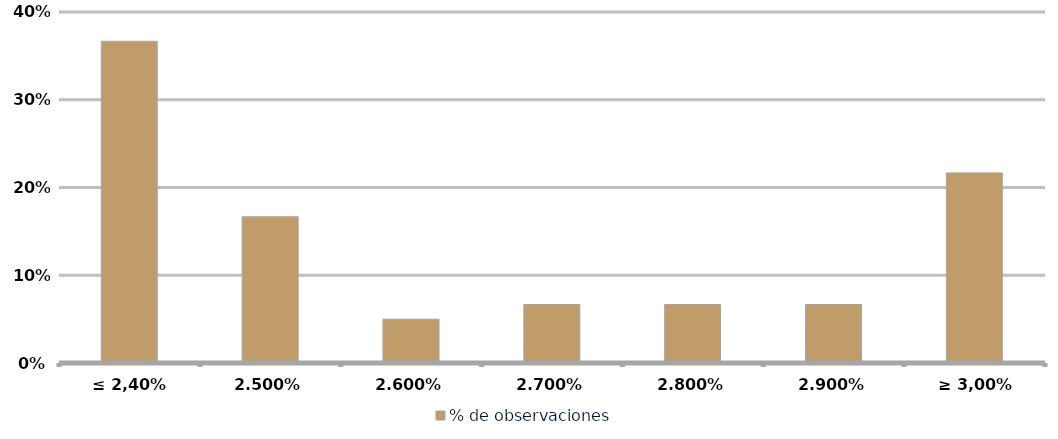
| Category | % de observaciones  |
|---|---|
| ≤ 2,40% | 0.367 |
| 2.50% | 0.167 |
| 2.60% | 0.05 |
| 2.70% | 0.067 |
| 2.80% | 0.067 |
| 2.90% | 0.067 |
| ≥ 3,00% | 0.217 |